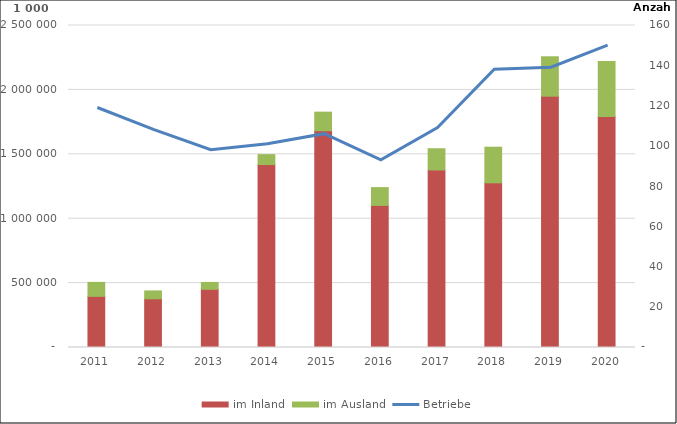
| Category | im Inland | im Ausland |
|---|---|---|
| 2011 | 397236.456 | 108321.958 |
| 2012 | 378032.569 | 61206.368 |
| 2013 | 451784.38 | 53146.283 |
| 2014 | 1420401.623 | 77084.75 |
| 2015 | 1683010.285 | 144289.831 |
| 2016 | 1103125.331 | 138341.391 |
| 2017 | 1378402.039 | 164793.669 |
| 2018 | 1278370.32 | 276718.959 |
| 2019 | 1951302.842 | 305807.369 |
| 2020 | 1793155.63 | 427264.442 |